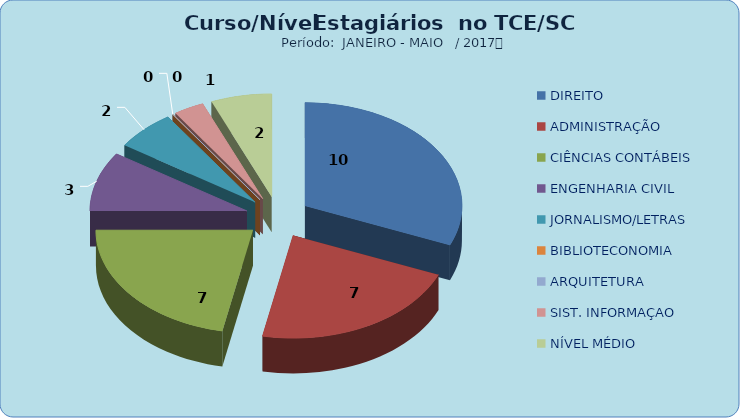
| Category | Series 0 |
|---|---|
| DIREITO | 10 |
| ADMINISTRAÇÃO | 7 |
| CIÊNCIAS CONTÁBEIS | 7 |
| ENGENHARIA CIVIL | 3 |
| JORNALISMO/LETRAS | 2 |
| BIBLIOTECONOMIA | 0 |
| ARQUITETURA | 0 |
| SIST. INFORMAÇAO | 1 |
| NÍVEL MÉDIO | 2 |